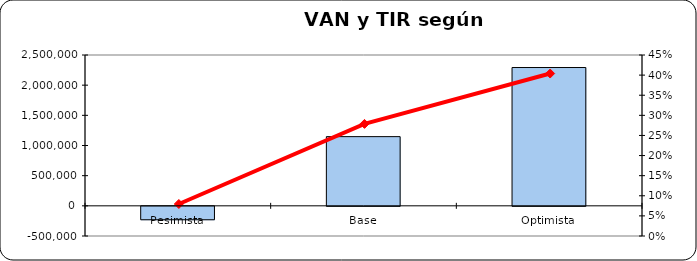
| Category | VAN DEL PROYECTO 1.147.002 Eur |
|---|---|
| Pesimista | -222446.169 |
| Base | 1147001.529 |
| Optimista | 2292454.709 |